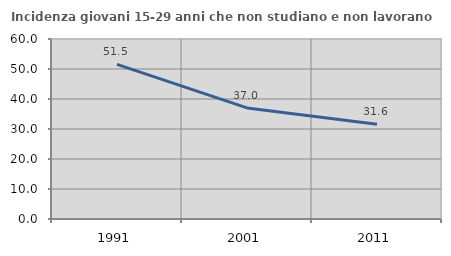
| Category | Incidenza giovani 15-29 anni che non studiano e non lavorano  |
|---|---|
| 1991.0 | 51.542 |
| 2001.0 | 37.019 |
| 2011.0 | 31.571 |